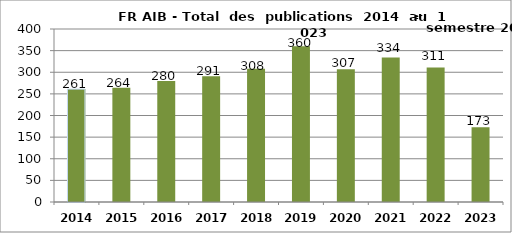
| Category | Graphe total publications |
|---|---|
| 2014.0 | 261 |
| 2015.0 | 264 |
| 2016.0 | 280 |
| 2017.0 | 291 |
| 2018.0 | 308 |
| 2019.0 | 360 |
| 2020.0 | 307 |
| 2021.0 | 334 |
| 2022.0 | 311 |
| 2023.0 | 173 |